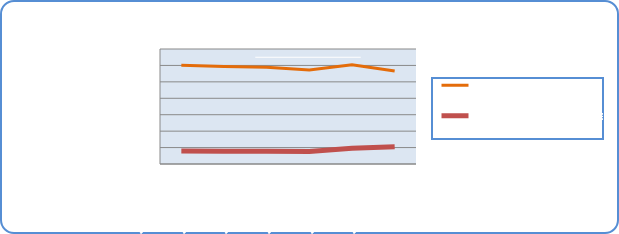
| Category | Motorin Türleri | Benzin Türleri |
|---|---|---|
| 11/11/19 | 60069285.887 | 7881428.533 |
| 11/12/19 | 59349203.122 | 7801528.779 |
| 11/13/19 | 58920592.203 | 7803474.651 |
| 11/14/19 | 57152828.349 | 7610458.816 |
| 11/15/19 | 60419871.847 | 9514332.884 |
| 11/16/19 | 56622078.9 | 10429524.088 |